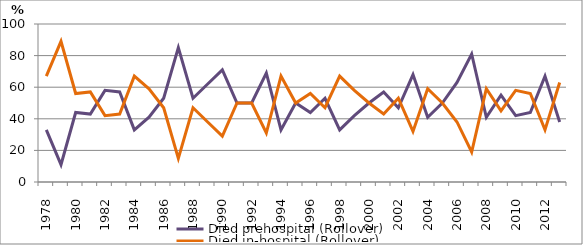
| Category | Died prehospital (Rollover) | Died in-hospital (Rollover) |
|---|---|---|
| 1978.0 | 33 | 67 |
| 1979.0 | 11 | 89 |
| 1980.0 | 44 | 56 |
| 1981.0 | 43 | 57 |
| 1982.0 | 58 | 42 |
| 1983.0 | 57 | 43 |
| 1984.0 | 33 | 67 |
| 1985.0 | 41 | 59 |
| 1986.0 | 53 | 47 |
| 1987.0 | 85 | 15 |
| 1988.0 | 53 | 47 |
| 1989.0 | 62 | 38 |
| 1990.0 | 71 | 29 |
| 1991.0 | 50 | 50 |
| 1992.0 | 50 | 50 |
| 1993.0 | 69 | 31 |
| 1994.0 | 33 | 67 |
| 1995.0 | 50 | 50 |
| 1996.0 | 44 | 56 |
| 1997.0 | 53 | 47 |
| 1998.0 | 33 | 67 |
| 1999.0 | 42 | 58 |
| 2000.0 | 50 | 50 |
| 2001.0 | 57 | 43 |
| 2002.0 | 47 | 53 |
| 2003.0 | 68 | 32 |
| 2004.0 | 41 | 59 |
| 2005.0 | 50 | 50 |
| 2006.0 | 63 | 38 |
| 2007.0 | 81 | 19 |
| 2008.0 | 41 | 59 |
| 2009.0 | 55 | 45 |
| 2010.0 | 42 | 58 |
| 2011.0 | 44 | 56 |
| 2012.0 | 67 | 33 |
| 2013.0 | 38 | 63 |